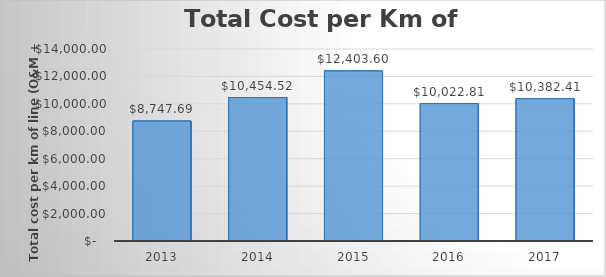
| Category | Series 0 |
|---|---|
| 2013.0 | 8747.694 |
| 2014.0 | 10454.515 |
| 2015.0 | 12403.602 |
| 2016.0 | 10022.807 |
| 2017.0 | 10382.41 |